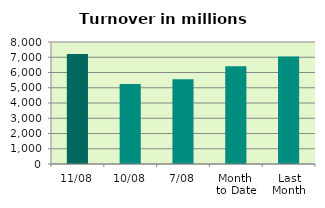
| Category | Series 0 |
|---|---|
| 11/08 | 7212.233 |
| 10/08 | 5237.828 |
| 7/08 | 5561.94 |
| Month 
to Date | 6414.403 |
| Last
Month | 7041.386 |